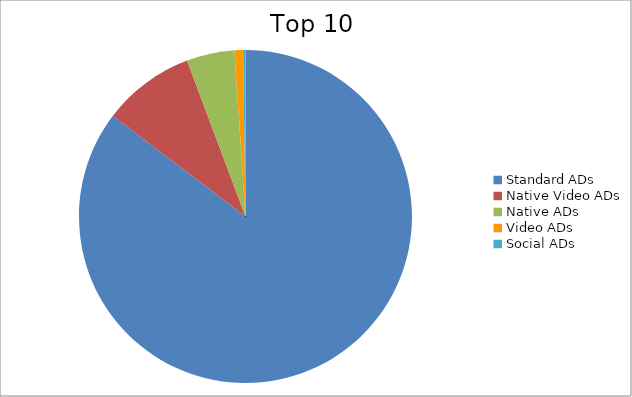
| Category | Series 0 |
|---|---|
| Standard ADs | 85.33 |
| Native Video ADs | 8.96 |
| Native ADs | 4.65 |
| Video ADs | 0.83 |
| Social ADs | 0.23 |